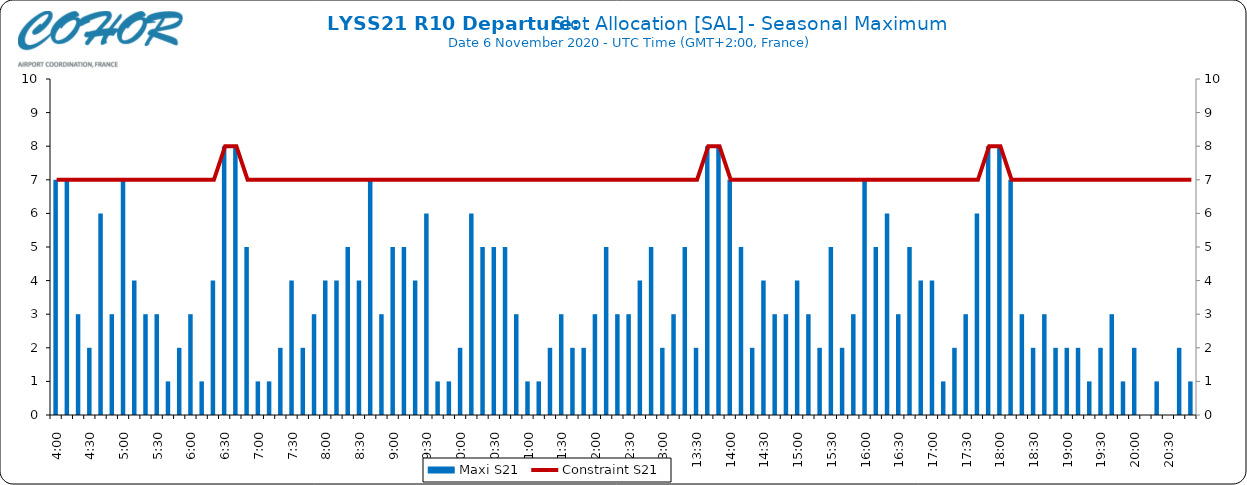
| Category | Maxi S21 |
|---|---|
| 0.16666666666666666 | 7 |
| 0.17361111111111113 | 7 |
| 0.18055555555555555 | 3 |
| 0.1875 | 2 |
| 0.19444444444444445 | 6 |
| 0.20138888888888887 | 3 |
| 0.20833333333333334 | 7 |
| 0.2152777777777778 | 4 |
| 0.2222222222222222 | 3 |
| 0.22916666666666666 | 3 |
| 0.23611111111111113 | 1 |
| 0.24305555555555555 | 2 |
| 0.25 | 3 |
| 0.2569444444444445 | 1 |
| 0.2638888888888889 | 4 |
| 0.2708333333333333 | 8 |
| 0.2777777777777778 | 8 |
| 0.2847222222222222 | 5 |
| 0.2916666666666667 | 1 |
| 0.2986111111111111 | 1 |
| 0.3055555555555555 | 2 |
| 0.3125 | 4 |
| 0.3194444444444445 | 2 |
| 0.3263888888888889 | 3 |
| 0.3333333333333333 | 4 |
| 0.34027777777777773 | 4 |
| 0.34722222222222227 | 5 |
| 0.3541666666666667 | 4 |
| 0.3611111111111111 | 7 |
| 0.3680555555555556 | 3 |
| 0.375 | 5 |
| 0.3819444444444444 | 5 |
| 0.3888888888888889 | 4 |
| 0.3958333333333333 | 6 |
| 0.40277777777777773 | 1 |
| 0.40972222222222227 | 1 |
| 0.4166666666666667 | 2 |
| 0.4236111111111111 | 6 |
| 0.4305555555555556 | 5 |
| 0.4375 | 5 |
| 0.4444444444444444 | 5 |
| 0.4513888888888889 | 3 |
| 0.4583333333333333 | 1 |
| 0.46527777777777773 | 1 |
| 0.47222222222222227 | 2 |
| 0.4791666666666667 | 3 |
| 0.4861111111111111 | 2 |
| 0.4930555555555556 | 2 |
| 0.5 | 3 |
| 0.5069444444444444 | 5 |
| 0.513888888888889 | 3 |
| 0.5208333333333334 | 3 |
| 0.5277777777777778 | 4 |
| 0.5347222222222222 | 5 |
| 0.5416666666666666 | 2 |
| 0.548611111111111 | 3 |
| 0.5555555555555556 | 5 |
| 0.5625 | 2 |
| 0.5694444444444444 | 8 |
| 0.576388888888889 | 8 |
| 0.5833333333333334 | 7 |
| 0.5902777777777778 | 5 |
| 0.5972222222222222 | 2 |
| 0.6041666666666666 | 4 |
| 0.611111111111111 | 3 |
| 0.6180555555555556 | 3 |
| 0.625 | 4 |
| 0.6319444444444444 | 3 |
| 0.638888888888889 | 2 |
| 0.6458333333333334 | 5 |
| 0.6527777777777778 | 2 |
| 0.6597222222222222 | 3 |
| 0.6666666666666666 | 7 |
| 0.6736111111111112 | 5 |
| 0.6805555555555555 | 6 |
| 0.6875 | 3 |
| 0.6944444444444445 | 5 |
| 0.7013888888888888 | 4 |
| 0.7083333333333334 | 4 |
| 0.7152777777777778 | 1 |
| 0.7222222222222222 | 2 |
| 0.7291666666666666 | 3 |
| 0.7361111111111112 | 6 |
| 0.7430555555555555 | 8 |
| 0.75 | 8 |
| 0.7569444444444445 | 7 |
| 0.7638888888888888 | 3 |
| 0.7708333333333334 | 2 |
| 0.7777777777777778 | 3 |
| 0.7847222222222222 | 2 |
| 0.7916666666666666 | 2 |
| 0.7986111111111112 | 2 |
| 0.8055555555555555 | 1 |
| 0.8125 | 2 |
| 0.8194444444444445 | 3 |
| 0.8263888888888888 | 1 |
| 0.8333333333333334 | 2 |
| 0.8402777777777778 | 0 |
| 0.8472222222222222 | 1 |
| 0.8541666666666666 | 0 |
| 0.8611111111111112 | 2 |
| 0.8680555555555555 | 1 |